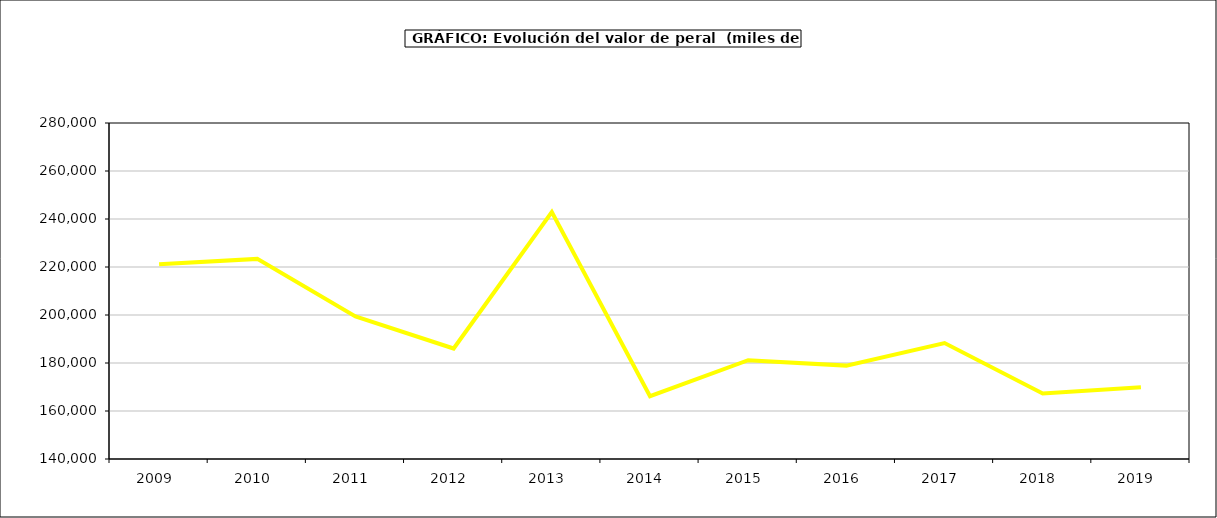
| Category | valor peral |
|---|---|
| 2009.0 | 221127.625 |
| 2010.0 | 223375.858 |
| 2011.0 | 199365.811 |
| 2012.0 | 186031.625 |
| 2013.0 | 242867.092 |
| 2014.0 | 166145.606 |
| 2015.0 | 181166 |
| 2016.0 | 178909 |
| 2017.0 | 188326.979 |
| 2018.0 | 167289.385 |
| 2019.0 | 169898.246 |